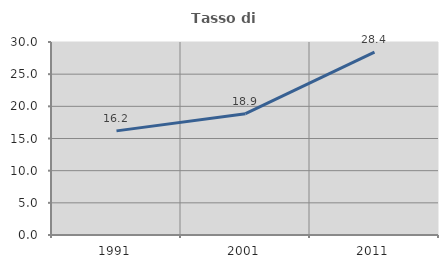
| Category | Tasso di occupazione   |
|---|---|
| 1991.0 | 16.185 |
| 2001.0 | 18.852 |
| 2011.0 | 28.421 |